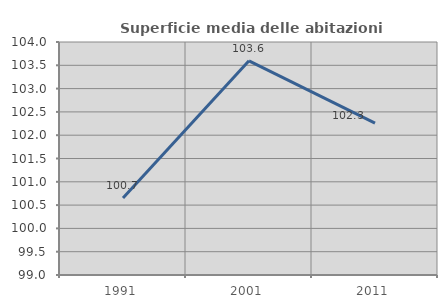
| Category | Superficie media delle abitazioni occupate |
|---|---|
| 1991.0 | 100.651 |
| 2001.0 | 103.596 |
| 2011.0 | 102.26 |